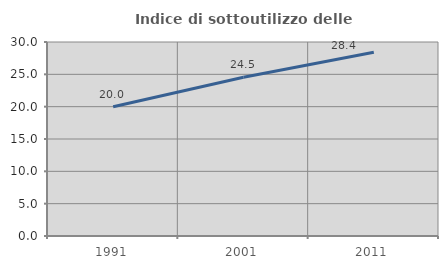
| Category | Indice di sottoutilizzo delle abitazioni  |
|---|---|
| 1991.0 | 19.989 |
| 2001.0 | 24.537 |
| 2011.0 | 28.414 |